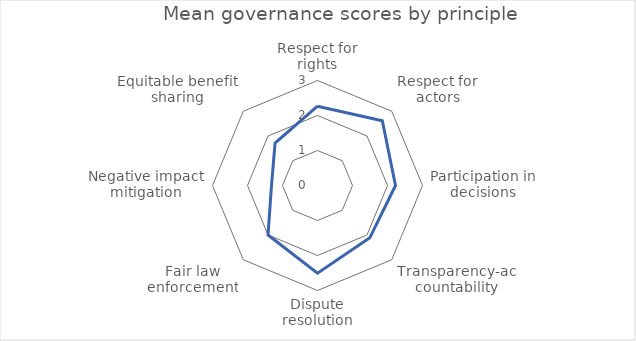
| Category | Mean |
|---|---|
| Respect for rights | 2.267 |
| Respect for actors | 2.619 |
| Participation in decisions | 2.229 |
| Transparency-accountability | 2.114 |
| Dispute resolution | 2.507 |
| Fair law enforcement | 2 |
| Negative impact mitigation | 1.314 |
| Equitable benefit sharing | 1.714 |